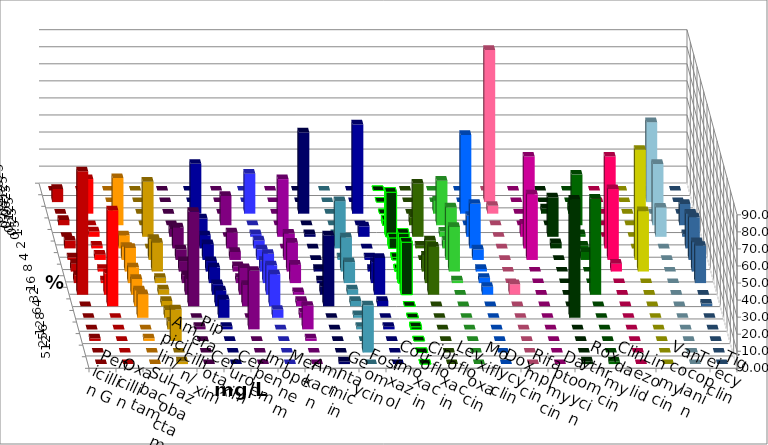
| Category | Penicillin G | Oxacillin | Ampicillin/ Sulbactam | Piperacillin/ Tazobactam | Cefotaxim | Cefuroxim | Imipenem | Meropenem | Amikacin | Gentamicin | Fosfomycin | Cotrimoxazol | Ciprofloxacin | Levofloxacin | Moxifloxacin | Doxycyclin | Rifampicin | Daptomycin | Roxythromycin | Clindamycin | Linezolid | Vancomycin | Teicoplanin | Tigecyclin |
|---|---|---|---|---|---|---|---|---|---|---|---|---|---|---|---|---|---|---|---|---|---|---|---|---|
| 0.015625 | 0 | 0 | 0 | 0 | 0 | 0 | 0 | 0 | 0 | 0 | 0 | 0 | 0 | 0 | 0 | 0 | 0 | 0 | 0 | 0 | 0 | 0 | 0 | 0 |
| 0.03125 | 7.692 | 0 | 0 | 0 | 0 | 0 | 0 | 0 | 0 | 0 | 0 | 0 | 0 | 0 | 0 | 0 | 89.231 | 0 | 0 | 0 | 0 | 0 | 0 | 46.875 |
| 0.0625 | 0 | 20.312 | 0 | 0 | 0 | 0 | 29.231 | 23.438 | 0 | 47.692 | 0 | 52.308 | 0 | 0 | 7.692 | 46.154 | 4.615 | 0 | 3.077 | 4.688 | 0 | 0 | 0 | 0 |
| 0.125 | 3.077 | 0 | 27.692 | 0 | 0 | 17.188 | 0 | 0 | 0 | 0 | 0 | 0 | 3.077 | 4.688 | 26.154 | 0 | 0 | 0 | 0 | 29.688 | 0 | 0 | 12.5 | 35.938 |
| 0.25 | 0 | 3.125 | 0 | 32.308 | 4.615 | 0 | 10.769 | 1.562 | 33.846 | 1.538 | 1.538 | 6.154 | 26.154 | 31.25 | 3.077 | 12.308 | 0 | 7.692 | 23.077 | 1.562 | 0 | 0 | 1.562 | 17.188 |
| 0.5 | 4.615 | 1.562 | 7.692 | 0 | 12.308 | 9.375 | 7.692 | 4.688 | 0 | 0 | 27.692 | 0 | 6.154 | 1.562 | 4.615 | 26.154 | 0 | 53.846 | 3.077 | 1.562 | 53.846 | 0 | 20.312 | 0 |
| 1.0 | 1.538 | 3.125 | 7.692 | 12.308 | 6.154 | 4.688 | 9.231 | 6.25 | 15.385 | 0 | 1.538 | 1.538 | 1.538 | 0 | 30.769 | 6.154 | 0 | 38.462 | 0 | 4.688 | 41.538 | 64.615 | 25 | 0 |
| 2.0 | 4.615 | 1.562 | 13.846 | 16.923 | 6.154 | 3.125 | 6.154 | 6.25 | 16.923 | 1.538 | 20 | 1.538 | 1.538 | 9.375 | 26.154 | 1.538 | 0 | 0 | 0 | 0 | 4.615 | 35.385 | 17.188 | 0 |
| 4.0 | 4.615 | 1.562 | 9.231 | 3.077 | 4.615 | 3.125 | 9.231 | 17.188 | 10.769 | 1.538 | 12.308 | 12.308 | 29.231 | 25 | 1.538 | 3.077 | 0 | 0 | 0 | 0 | 0 | 0 | 21.875 | 0 |
| 8.0 | 72.308 | 12.5 | 9.231 | 3.077 | 9.231 | 15.625 | 6.154 | 17.188 | 1.538 | 4.615 | 3.077 | 21.538 | 30.769 | 28.125 | 0 | 4.615 | 6.154 | 0 | 0 | 56.25 | 0 | 0 | 0 | 0 |
| 16.0 | 0 | 56.25 | 9.231 | 3.077 | 55.385 | 12.5 | 9.231 | 18.75 | 3.077 | 41.538 | 3.077 | 3.077 | 0 | 0 | 0 | 0 | 0 | 0 | 0 | 0 | 0 | 0 | 1.562 | 0 |
| 32.0 | 0 | 0 | 13.846 | 4.615 | 0 | 0 | 10.769 | 4.688 | 3.077 | 0 | 1.538 | 0 | 0 | 0 | 0 | 0 | 0 | 0 | 69.231 | 0 | 0 | 0 | 0 | 0 |
| 64.0 | 0 | 0 | 0 | 4.615 | 1.538 | 34.375 | 1.538 | 0 | 13.846 | 0 | 1.538 | 1.538 | 1.538 | 0 | 0 | 0 | 0 | 0 | 0 | 0 | 0 | 0 | 0 | 0 |
| 128.0 | 1.538 | 0 | 1.538 | 18.462 | 0 | 0 | 0 | 0 | 1.538 | 0 | 0 | 0 | 0 | 0 | 0 | 0 | 0 | 0 | 0 | 0 | 0 | 0 | 0 | 0 |
| 256.0 | 0 | 0 | 0 | 0 | 0 | 0 | 0 | 0 | 0 | 0 | 27.692 | 0 | 0 | 0 | 0 | 0 | 0 | 0 | 0 | 0 | 0 | 0 | 0 | 0 |
| 512.0 | 0 | 0 | 0 | 1.538 | 0 | 0 | 0 | 0 | 0 | 1.538 | 0 | 0 | 0 | 0 | 0 | 0 | 0 | 0 | 1.538 | 1.562 | 0 | 0 | 0 | 0 |